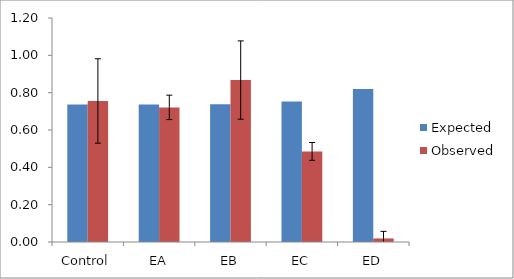
| Category | Expected | Observed |
|---|---|---|
| Control | 0.736 | 0.756 |
| EA | 0.736 | 0.721 |
| EB | 0.738 | 0.868 |
| EC | 0.753 | 0.485 |
| ED | 0.82 | 0.019 |